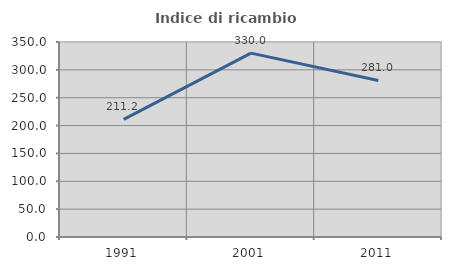
| Category | Indice di ricambio occupazionale  |
|---|---|
| 1991.0 | 211.18 |
| 2001.0 | 330 |
| 2011.0 | 281.046 |